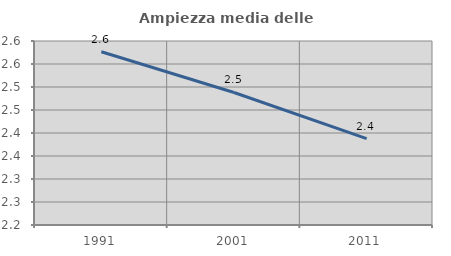
| Category | Ampiezza media delle famiglie |
|---|---|
| 1991.0 | 2.577 |
| 2001.0 | 2.488 |
| 2011.0 | 2.388 |